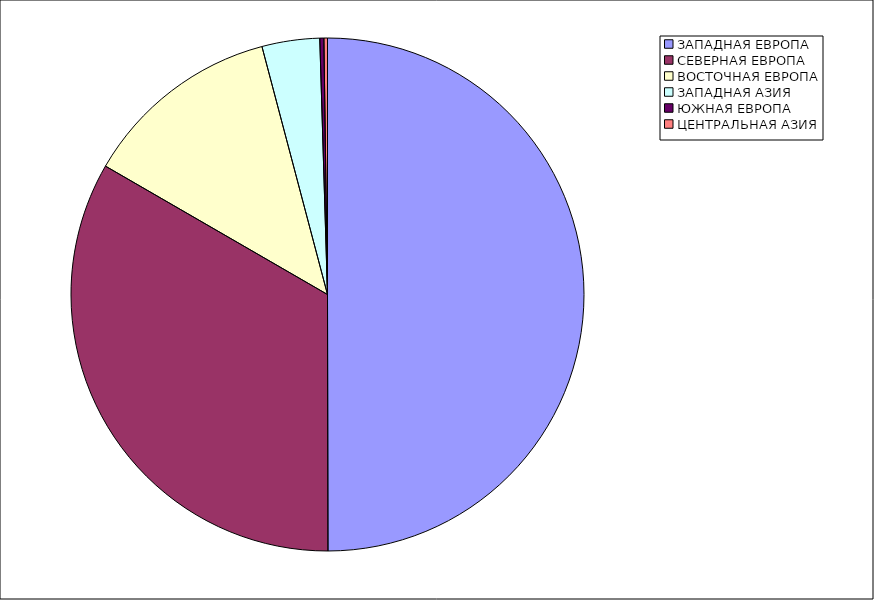
| Category | Оборот |
|---|---|
| ЗАПАДНАЯ ЕВРОПА | 49.971 |
| СЕВЕРНАЯ ЕВРОПА | 33.373 |
| ВОСТОЧНАЯ ЕВРОПА | 12.542 |
| ЗАПАДНАЯ АЗИЯ | 3.633 |
| ЮЖНАЯ ЕВРОПА | 0.256 |
| ЦЕНТРАЛЬНАЯ АЗИЯ | 0.224 |